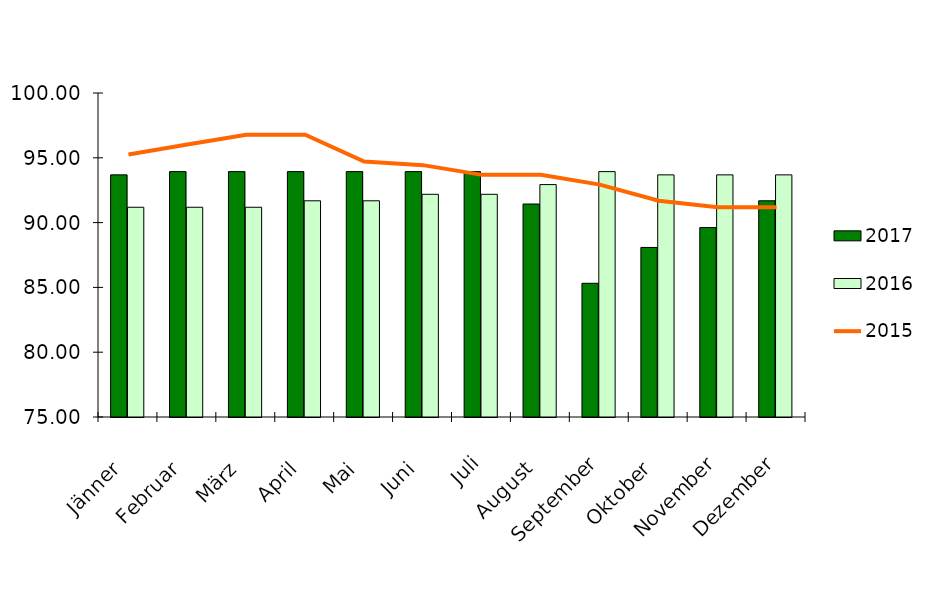
| Category | 2017 | 2016 |
|---|---|---|
| Jänner | 93.683 | 91.183 |
| Februar | 93.933 | 91.183 |
| März | 93.933 | 91.183 |
| April | 93.933 | 91.683 |
| Mai | 93.933 | 91.683 |
| Juni | 93.933 | 92.183 |
| Juli | 93.933 | 92.183 |
| August | 91.433 | 92.933 |
| September | 85.317 | 93.933 |
| Oktober | 88.083 | 93.683 |
| November | 89.617 | 93.683 |
| Dezember | 91.683 | 93.683 |